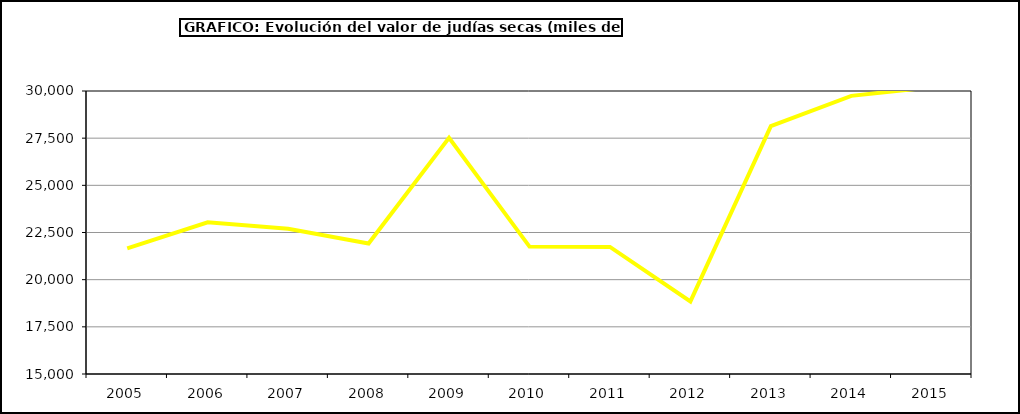
| Category | Valor |
|---|---|
| 2005.0 | 21658.048 |
| 2006.0 | 23036.992 |
| 2007.0 | 22696.538 |
| 2008.0 | 21912.603 |
| 2009.0 | 27515.988 |
| 2010.0 | 21751.277 |
| 2011.0 | 21735.778 |
| 2012.0 | 18845.19 |
| 2013.0 | 28136.167 |
| 2014.0 | 29742.558 |
| 2015.0 | 30200 |